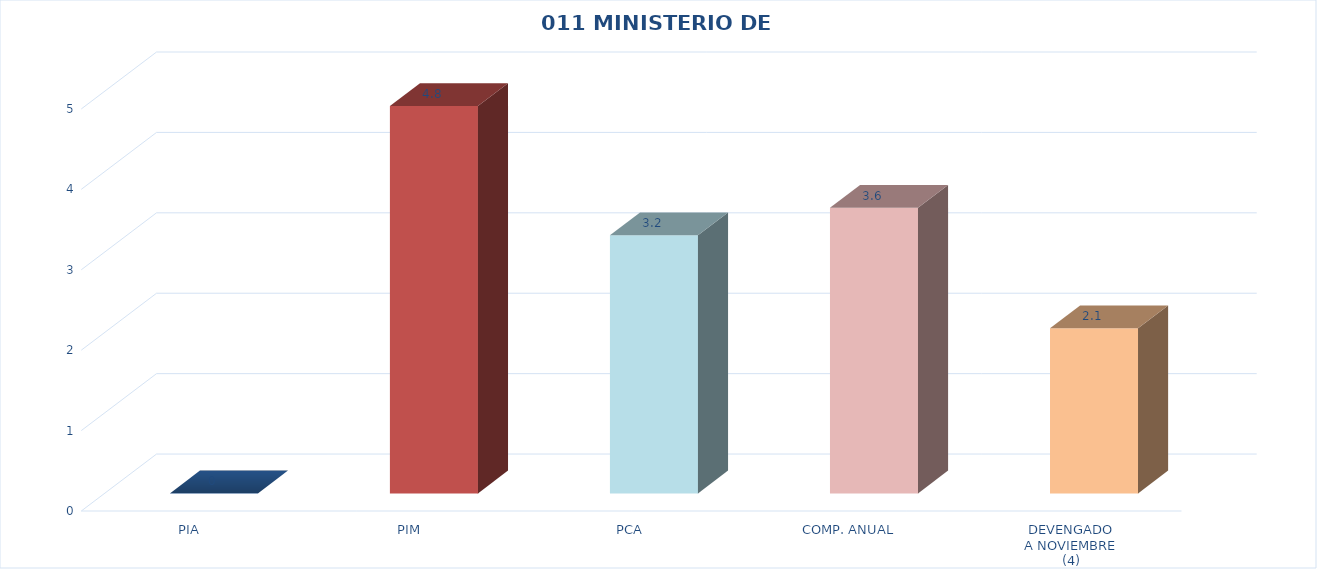
| Category | 011 MINISTERIO DE SALUD |
|---|---|
| PIA | 0 |
| PIM | 4.818 |
| PCA | 3.21 |
| COMP. ANUAL | 3.551 |
| DEVENGADO
A NOVIEMBRE
(4) | 2.054 |